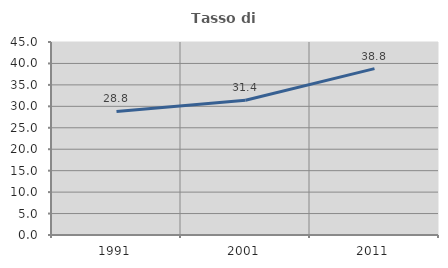
| Category | Tasso di occupazione   |
|---|---|
| 1991.0 | 28.815 |
| 2001.0 | 31.435 |
| 2011.0 | 38.801 |